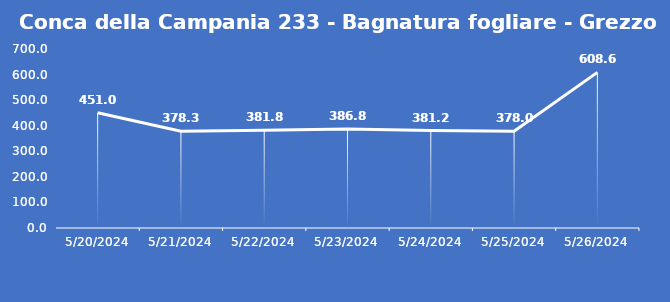
| Category | Conca della Campania 233 - Bagnatura fogliare - Grezzo (min) |
|---|---|
| 5/20/24 | 451 |
| 5/21/24 | 378.3 |
| 5/22/24 | 381.8 |
| 5/23/24 | 386.8 |
| 5/24/24 | 381.2 |
| 5/25/24 | 378 |
| 5/26/24 | 608.6 |